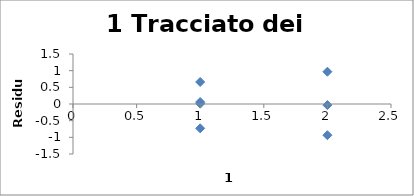
| Category | Series 0 |
|---|---|
| 2.0 | -0.033 |
| 1.0 | -0.73 |
| 1.0 | 0.661 |
| 2.0 | 0.969 |
| 2.0 | -0.936 |
| 1.0 | 0.01 |
| 1.0 | 0.059 |